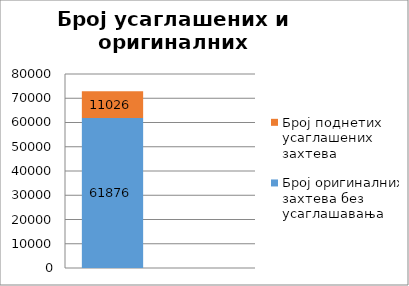
| Category | Број оригиналних захтева без усаглашавања | Број поднетих усаглашених захтева |
|---|---|---|
| 0 | 61876 | 11026 |
| 1 | 0.849 | 0.151 |